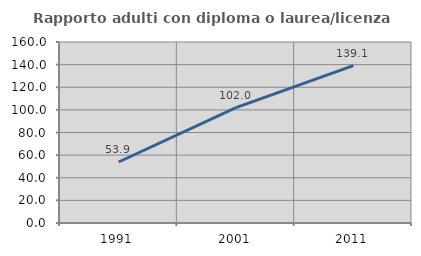
| Category | Rapporto adulti con diploma o laurea/licenza media  |
|---|---|
| 1991.0 | 53.925 |
| 2001.0 | 101.994 |
| 2011.0 | 139.08 |